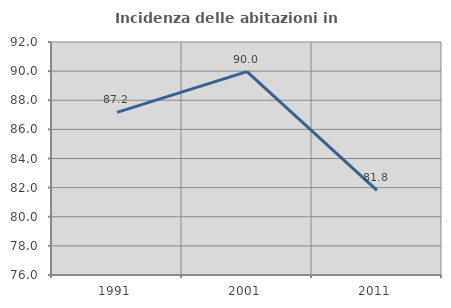
| Category | Incidenza delle abitazioni in proprietà  |
|---|---|
| 1991.0 | 87.168 |
| 2001.0 | 89.965 |
| 2011.0 | 81.818 |